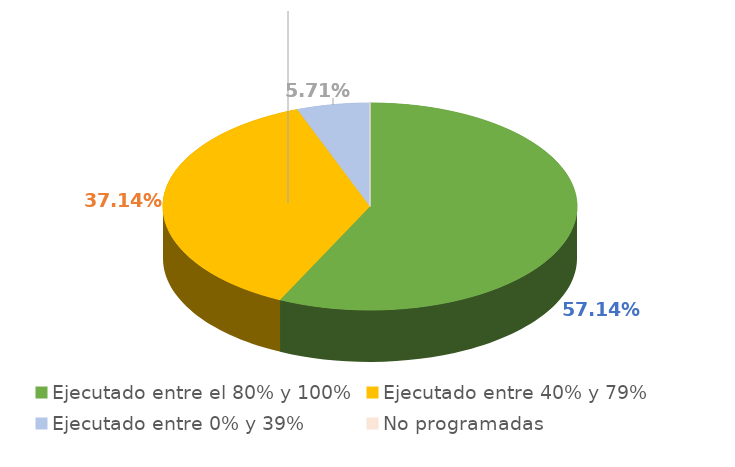
| Category | Series 0 |
|---|---|
| Ejecutado entre el 80% y 100% | 0.571 |
| Ejecutado entre 40% y 79% | 0.371 |
| Ejecutado entre 0% y 39% | 0.057 |
| No programadas | 0 |